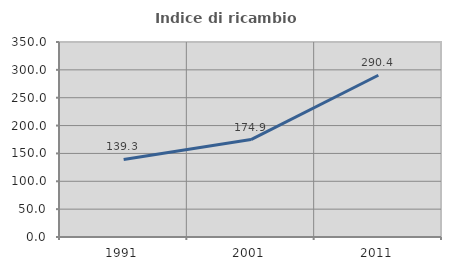
| Category | Indice di ricambio occupazionale  |
|---|---|
| 1991.0 | 139.286 |
| 2001.0 | 174.866 |
| 2011.0 | 290.365 |